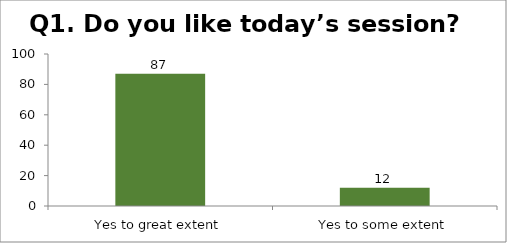
| Category | Q1. Do you like today’s session? |
|---|---|
| Yes to great extent | 87 |
| Yes to some extent | 12 |